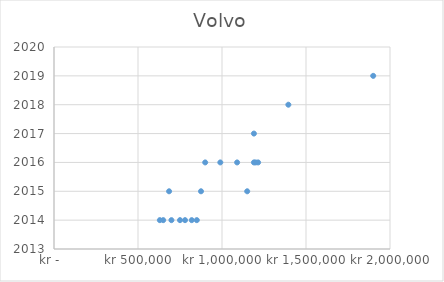
| Category | Series 0 |
|---|---|
| 850000.0 | 2014 |
| 820000.0 | 2014 |
| 780000.0 | 2014 |
| 750000.0 | 2014 |
| 699000.0 | 2014 |
| 650000.0 | 2014 |
| 630000.0 | 2014 |
| 685000.0 | 2015 |
| 1150000.0 | 2015 |
| 875000.0 | 2015 |
| 900000.0 | 2016 |
| 1090000.0 | 2016 |
| 1215000.0 | 2016 |
| 1190000.0 | 2016 |
| 990000.0 | 2016 |
| 1200000.0 | 2016 |
| 1190000.0 | 2017 |
| 1395000.0 | 2018 |
| 1900000.0 | 2019 |